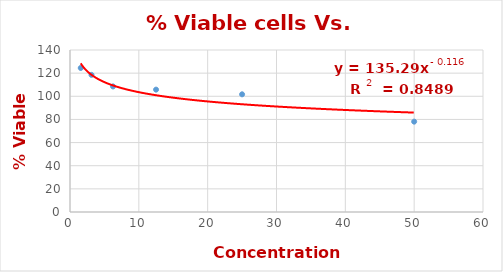
| Category | Series 0 |
|---|---|
| 50.0 | 78.085 |
| 25.0 | 101.702 |
| 12.5 | 105.745 |
| 6.25 | 108.511 |
| 3.125 | 118.511 |
| 1.5625 | 124.468 |